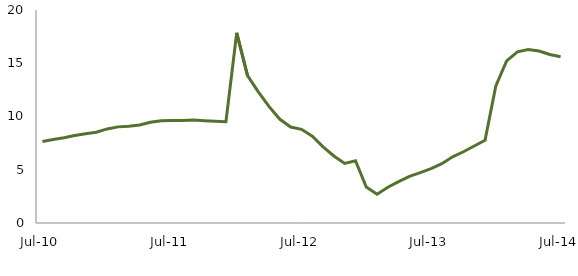
| Category | Series 0 |
|---|---|
| Jul-10 | 7.66 |
|  | 7.833 |
|  | 8.01 |
|  | 8.224 |
|  | 8.388 |
|  | 8.524 |
|  | 8.833 |
|  | 9.026 |
|  | 9.09 |
|  | 9.208 |
|  | 9.462 |
|  | 9.609 |
| Jul-11 | 9.617 |
|  | 9.625 |
|  | 9.681 |
|  | 9.607 |
|  | 9.549 |
|  | 9.507 |
|  | 17.862 |
|  | 13.836 |
|  | 12.306 |
|  | 10.924 |
|  | 9.737 |
|  | 9.012 |
| Jul-12 | 8.798 |
|  | 8.145 |
|  | 7.143 |
|  | 6.29 |
|  | 5.588 |
|  | 5.848 |
|  | 3.372 |
|  | 2.709 |
|  | 3.357 |
|  | 3.88 |
|  | 4.386 |
|  | 4.728 |
| Jul-13 | 5.103 |
|  | 5.569 |
|  | 6.219 |
|  | 6.691 |
|  | 7.233 |
|  | 7.764 |
|  | 12.871 |
|  | 15.229 |
|  | 16.075 |
|  | 16.29 |
|  | 16.142 |
|  | 15.823 |
| Jul-14 | 15.617 |